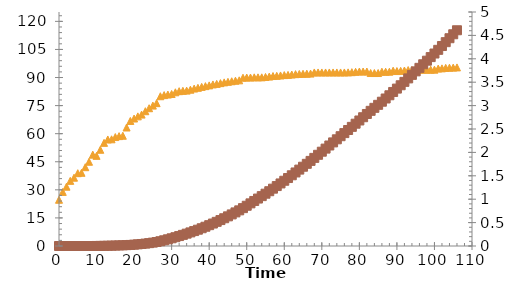
| Category | Series 0 |
|---|---|
| 0.0 | 24.7 |
| 1.0 | 28.9 |
| 2.0 | 31.7 |
| 3.0 | 34.8 |
| 4.0 | 36.5 |
| 5.0 | 38.9 |
| 6.0 | 39.1 |
| 7.0 | 42.1 |
| 8.0 | 45 |
| 9.0 | 48.8 |
| 10.0 | 48.15 |
| 11.0 | 51.4 |
| 12.0 | 55.1 |
| 13.0 | 56.9 |
| 14.0 | 57 |
| 15.0 | 58.2 |
| 16.0 | 58.7 |
| 17.0 | 58.9 |
| 18.0 | 63.3 |
| 19.0 | 66.8 |
| 20.0 | 68.1 |
| 21.0 | 69.25 |
| 22.0 | 70.2 |
| 23.0 | 72 |
| 24.0 | 73.6 |
| 25.0 | 75 |
| 26.0 | 76.3 |
| 27.0 | 80 |
| 28.0 | 80.6 |
| 29.0 | 80.9 |
| 30.0 | 81.2 |
| 31.0 | 82.1 |
| 32.0 | 82.7 |
| 33.0 | 82.9 |
| 34.0 | 83 |
| 35.0 | 83.5 |
| 36.0 | 84.1 |
| 37.0 | 84.5 |
| 38.0 | 85 |
| 39.0 | 85.4 |
| 40.0 | 85.8 |
| 41.0 | 86.3 |
| 42.0 | 86.6 |
| 43.0 | 87 |
| 44.0 | 87.4 |
| 45.0 | 87.7 |
| 46.0 | 88 |
| 47.0 | 88.3 |
| 48.0 | 88.5 |
| 49.0 | 89.9 |
| 50.0 | 90 |
| 51.0 | 90 |
| 52.0 | 90.1 |
| 53.0 | 90.1 |
| 54.0 | 90.1 |
| 55.0 | 90.3 |
| 56.0 | 90.5 |
| 57.0 | 90.8 |
| 58.0 | 90.9 |
| 59.0 | 91.1 |
| 60.0 | 91.3 |
| 61.0 | 91.4 |
| 62.0 | 91.6 |
| 63.0 | 91.8 |
| 64.0 | 91.9 |
| 65.0 | 92 |
| 66.0 | 92.05 |
| 67.0 | 92.1 |
| 68.0 | 92.7 |
| 69.0 | 92.7 |
| 70.0 | 92.7 |
| 71.0 | 92.7 |
| 72.0 | 92.7 |
| 73.0 | 92.7 |
| 74.0 | 92.7 |
| 75.0 | 92.7 |
| 76.0 | 92.7 |
| 77.0 | 92.75 |
| 78.0 | 92.85 |
| 79.0 | 93.05 |
| 80.0 | 93.2 |
| 81.0 | 93.2 |
| 82.0 | 93.2 |
| 83.0 | 92.4 |
| 84.0 | 92.4 |
| 85.0 | 92.4 |
| 86.0 | 93.1 |
| 87.0 | 93.1 |
| 88.0 | 93.1 |
| 89.0 | 93.65 |
| 90.0 | 93.45 |
| 91.0 | 93.55 |
| 92.0 | 93.75 |
| 93.0 | 94 |
| 94.0 | 94 |
| 95.0 | 94 |
| 96.0 | 94.2 |
| 97.0 | 94.2 |
| 98.0 | 94.2 |
| 99.0 | 94.2 |
| 100.0 | 94.2 |
| 101.0 | 94.8 |
| 102.0 | 94.9 |
| 103.0 | 95.15 |
| 104.0 | 95.25 |
| 105.0 | 95.3 |
| 106.0 | 95.4 |